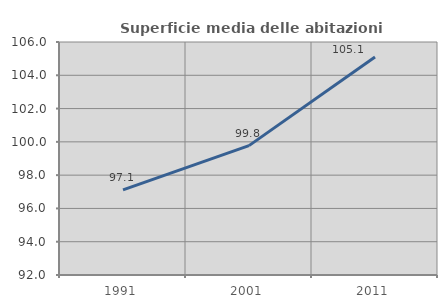
| Category | Superficie media delle abitazioni occupate |
|---|---|
| 1991.0 | 97.114 |
| 2001.0 | 99.775 |
| 2011.0 | 105.096 |